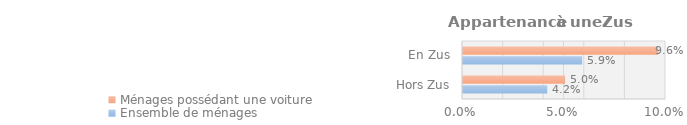
| Category | Ensemble de ménages | Ménages possédant une voiture |
|---|---|---|
| Hors Zus | 0.042 | 0.05 |
| En Zus | 0.059 | 0.096 |